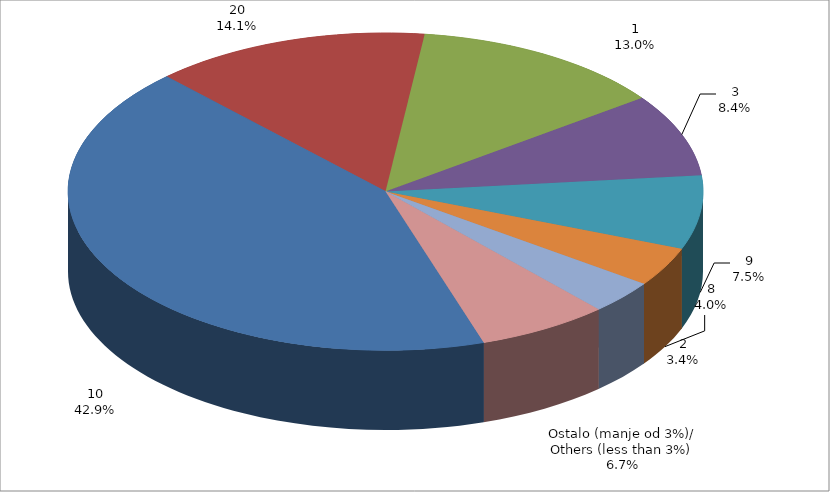
| Category | Series 0 |
|---|---|
| 10 | 14331624.529 |
| 20 | 4703514.87 |
| 1 | 4335728.91 |
| 3 | 2809293.843 |
| 9 | 2514796.212 |
| 8 | 1330627.953 |
| 2 | 1148429.73 |
| Ostalo (manje od 3%)/
Others (less than 3%) | 2239865.964 |